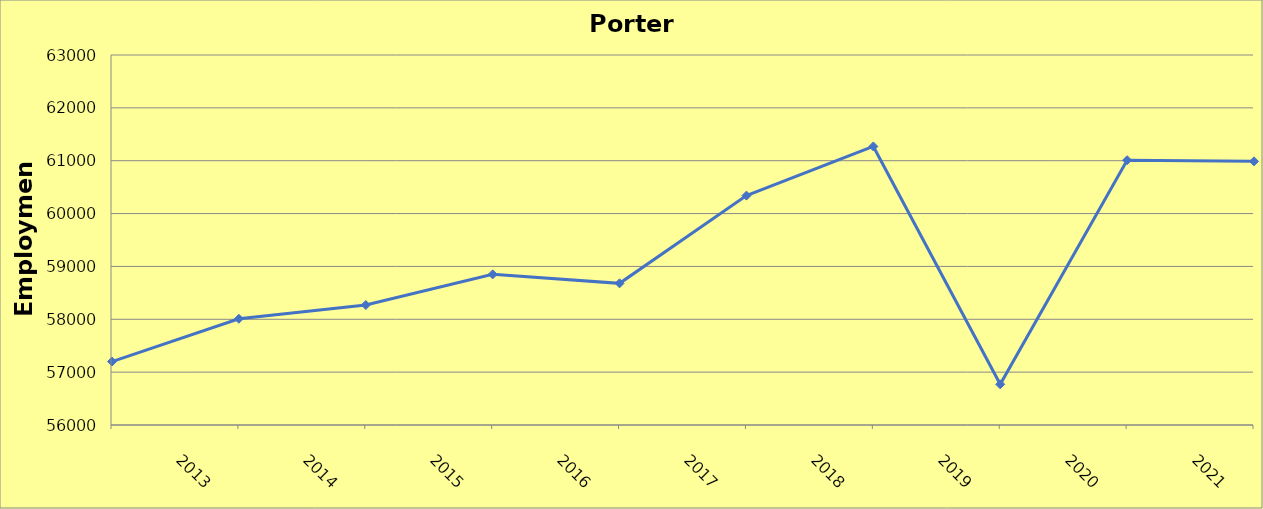
| Category | Porter County |
|---|---|
| 2013.0 | 57200 |
| 2014.0 | 58010 |
| 2015.0 | 58270 |
| 2016.0 | 58850 |
| 2017.0 | 58680 |
| 2018.0 | 60340 |
| 2019.0 | 61270 |
| 2020.0 | 56770 |
| 2021.0 | 61010 |
| 2022.0 | 60988 |